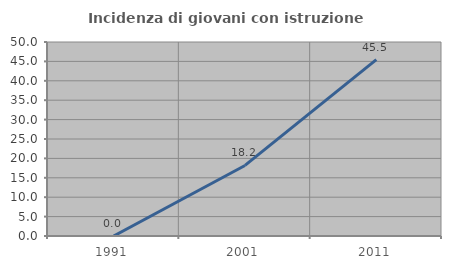
| Category | Incidenza di giovani con istruzione universitaria |
|---|---|
| 1991.0 | 0 |
| 2001.0 | 18.182 |
| 2011.0 | 45.455 |